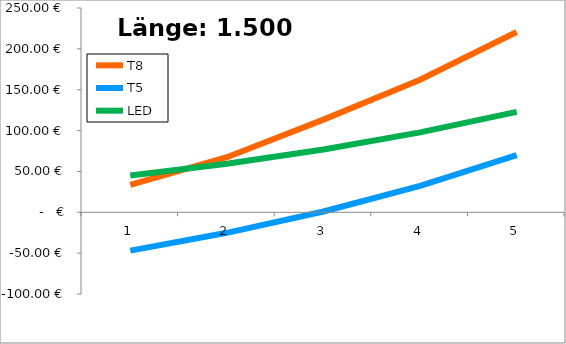
| Category | T8 | T5 | LED |
|---|---|---|---|
| 0 | 33.557 | -46.906 | 44.929 |
| 1 | 67.426 | -25.133 | 59.445 |
| 2 | 113.402 | 0.994 | 76.863 |
| 3 | 162.173 | 32.347 | 97.765 |
| 4 | 220.698 | 69.97 | 122.847 |